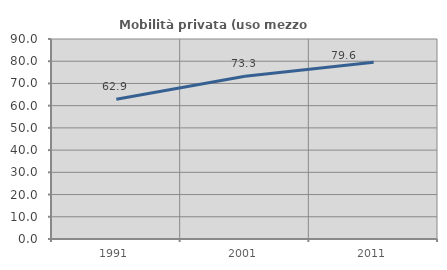
| Category | Mobilità privata (uso mezzo privato) |
|---|---|
| 1991.0 | 62.888 |
| 2001.0 | 73.25 |
| 2011.0 | 79.558 |